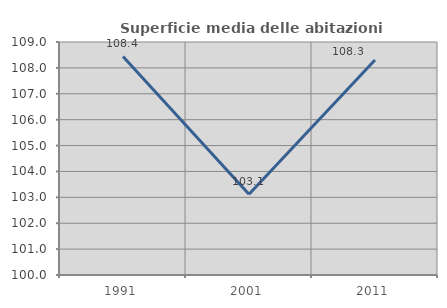
| Category | Superficie media delle abitazioni occupate |
|---|---|
| 1991.0 | 108.443 |
| 2001.0 | 103.12 |
| 2011.0 | 108.307 |